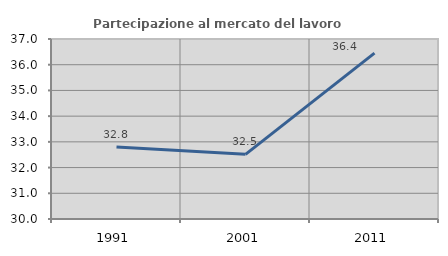
| Category | Partecipazione al mercato del lavoro  femminile |
|---|---|
| 1991.0 | 32.804 |
| 2001.0 | 32.516 |
| 2011.0 | 36.449 |